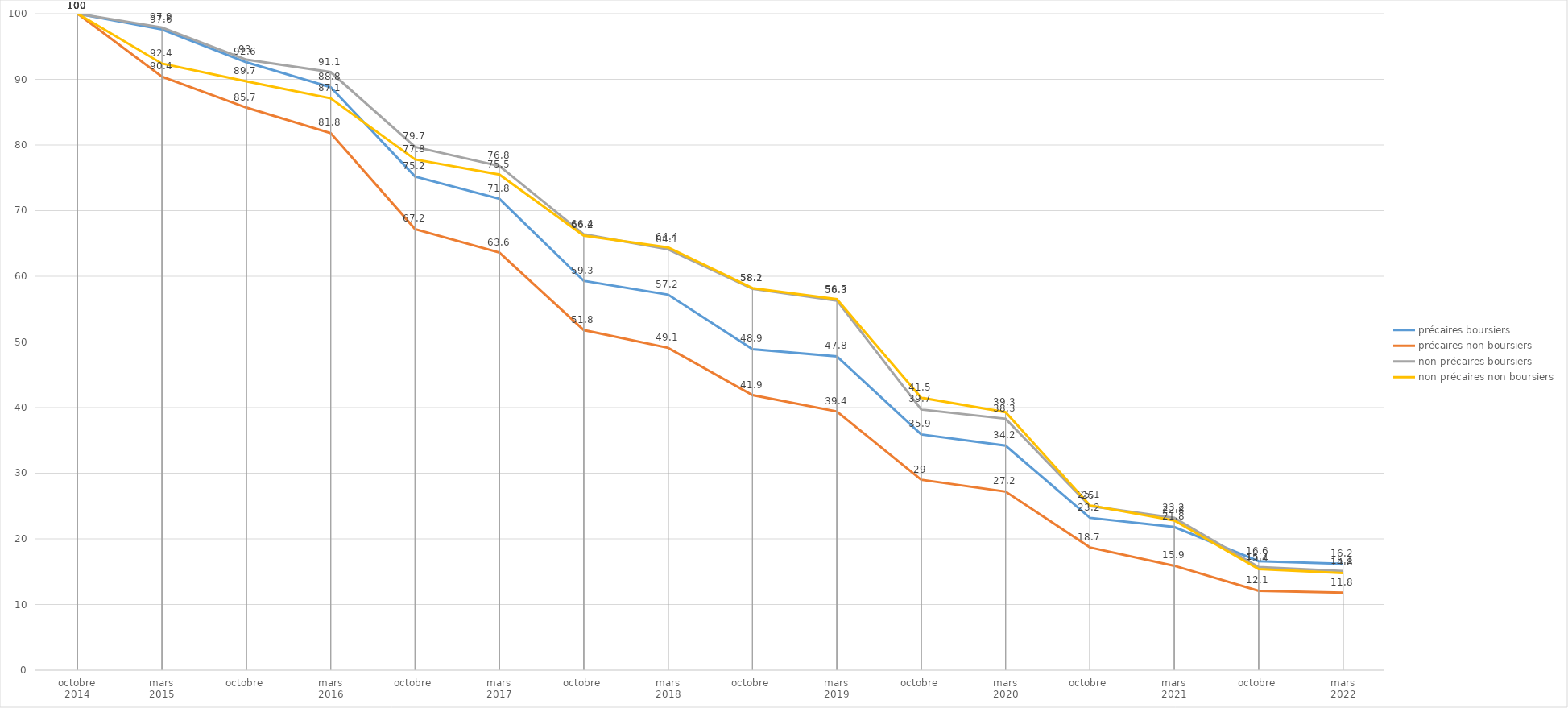
| Category | précaires boursiers | précaires non boursiers | non précaires boursiers | non précaires non boursiers |
|---|---|---|---|---|
| 0 | 100 | 100 | 100 | 100 |
| 1 | 97.6 | 90.4 | 97.9 | 92.4 |
| 2 | 92.6 | 85.7 | 93 | 89.7 |
| 3 | 88.8 | 81.8 | 91.1 | 87.1 |
| 4 | 75.2 | 67.2 | 79.7 | 77.8 |
| 5 | 71.8 | 63.6 | 76.8 | 75.5 |
| 6 | 59.3 | 51.8 | 66.4 | 66.2 |
| 7 | 57.2 | 49.1 | 64.1 | 64.4 |
| 8 | 48.9 | 41.9 | 58.1 | 58.2 |
| 9 | 47.8 | 39.4 | 56.3 | 56.5 |
| 10 | 35.9 | 29 | 39.7 | 41.5 |
| 11 | 34.2 | 27.2 | 38.3 | 39.3 |
| 12 | 23.2 | 18.7 | 25 | 25.1 |
| 13 | 21.8 | 15.9 | 23.2 | 22.8 |
| 14 | 16.6 | 12.1 | 15.7 | 15.4 |
| 15 | 16.2 | 11.8 | 15.1 | 14.8 |